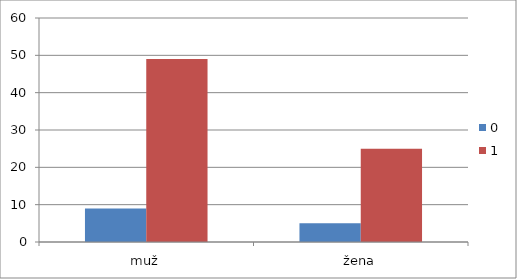
| Category | 0 | 1 |
|---|---|---|
| muž | 9 | 49 |
| žena | 5 | 25 |